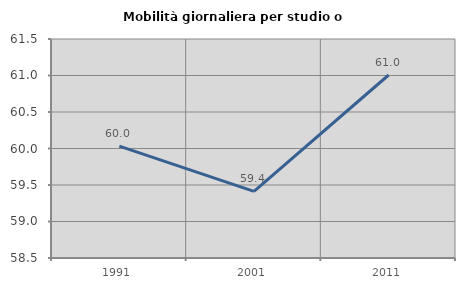
| Category | Mobilità giornaliera per studio o lavoro |
|---|---|
| 1991.0 | 60.032 |
| 2001.0 | 59.413 |
| 2011.0 | 61.007 |